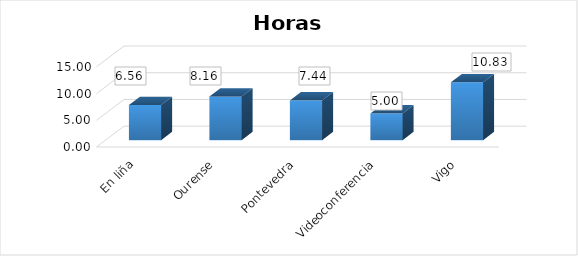
| Category | Series 0 |
|---|---|
| En liña | 6.56 |
| Ourense | 8.156 |
| Pontevedra | 7.439 |
| Videoconferencia | 5 |
| Vigo | 10.829 |